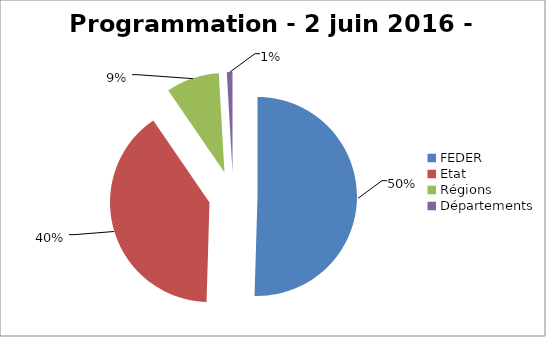
| Category | Series 0 |
|---|---|
| FEDER | 2747836.58 |
| Etat | 2176099.42 |
| Régions | 470038.73 |
| Départements | 50039.25 |